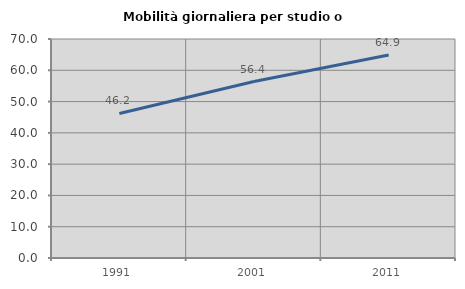
| Category | Mobilità giornaliera per studio o lavoro |
|---|---|
| 1991.0 | 46.203 |
| 2001.0 | 56.395 |
| 2011.0 | 64.908 |